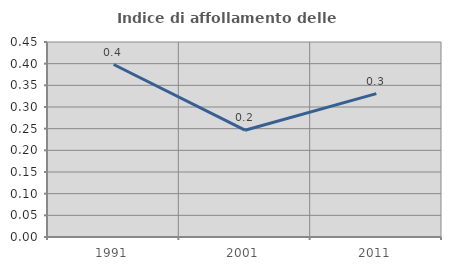
| Category | Indice di affollamento delle abitazioni  |
|---|---|
| 1991.0 | 0.398 |
| 2001.0 | 0.246 |
| 2011.0 | 0.331 |